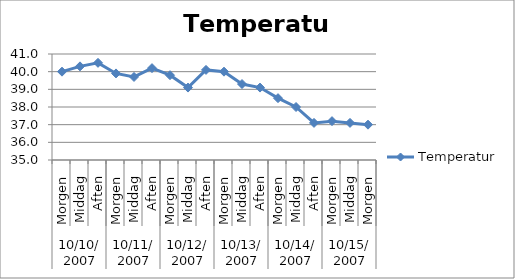
| Category | Temperatur |
|---|---|
| 0 | 40 |
| 1 | 40.3 |
| 2 | 40.5 |
| 3 | 39.9 |
| 4 | 39.7 |
| 5 | 40.2 |
| 6 | 39.8 |
| 7 | 39.1 |
| 8 | 40.1 |
| 9 | 40 |
| 10 | 39.3 |
| 11 | 39.1 |
| 12 | 38.5 |
| 13 | 38 |
| 14 | 37.1 |
| 15 | 37.2 |
| 16 | 37.1 |
| 17 | 37 |